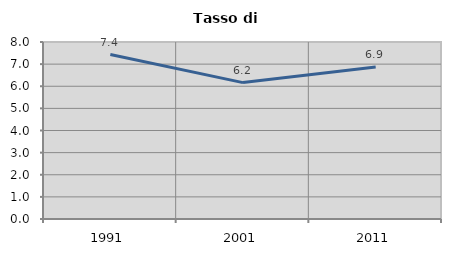
| Category | Tasso di disoccupazione   |
|---|---|
| 1991.0 | 7.432 |
| 2001.0 | 6.164 |
| 2011.0 | 6.875 |